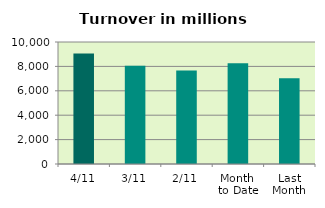
| Category | Series 0 |
|---|---|
| 4/11 | 9055.063 |
| 3/11 | 8054.492 |
| 2/11 | 7673.734 |
| Month 
to Date | 8261.096 |
| Last
Month | 7023.861 |